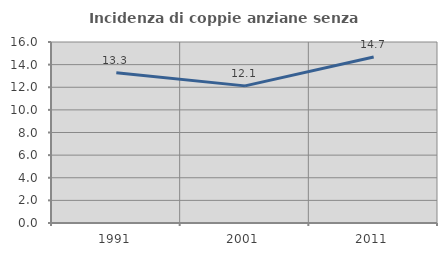
| Category | Incidenza di coppie anziane senza figli  |
|---|---|
| 1991.0 | 13.272 |
| 2001.0 | 12.121 |
| 2011.0 | 14.68 |